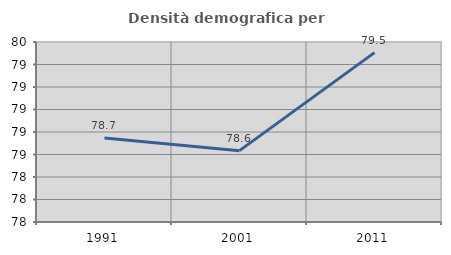
| Category | Densità demografica |
|---|---|
| 1991.0 | 78.746 |
| 2001.0 | 78.634 |
| 2011.0 | 79.506 |